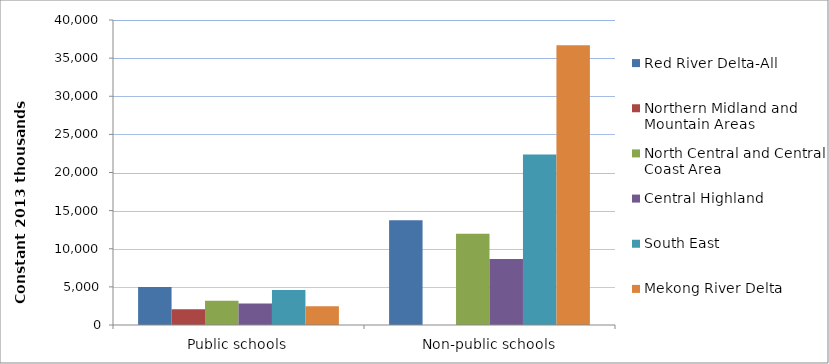
| Category | Red River Delta-All | Northern Midland and Mountain Areas | North Central and Central Coast Area | Central Highland | South East | Mekong River Delta |
|---|---|---|---|---|---|---|
| Public schools | 4985.319 | 2064.589 | 3165.93 | 2835.888 | 4586.728 | 2455.22 |
| Non-public schools | 13724.523 | 0 | 11974.72 | 8671.026 | 22363.11 | 36695.47 |